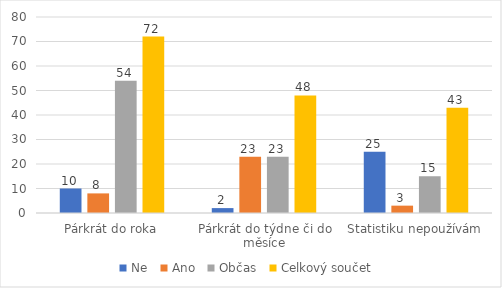
| Category | Ne | Ano | Občas | Celkový součet |
|---|---|---|---|---|
| Párkrát do roka | 10 | 8 | 54 | 72 |
| Párkrát do týdne či do měsíce | 2 | 23 | 23 | 48 |
| Statistiku nepoužívám | 25 | 3 | 15 | 43 |